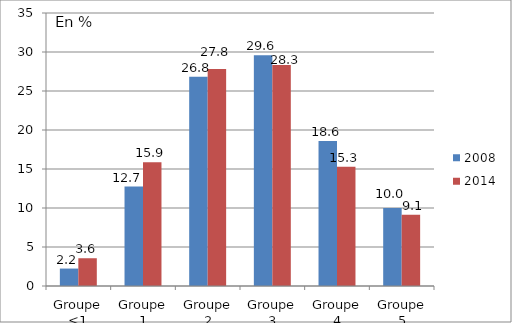
| Category | 2008 | 2014 |
|---|---|---|
| Groupe <1 | 2.235 | 3.559 |
| Groupe 1 | 12.749 | 15.88 |
| Groupe 2 | 26.831 | 27.822 |
| Groupe 3 | 29.591 | 28.319 |
| Groupe 4 | 18.594 | 15.287 |
| Groupe 5 | 10 | 9.132 |